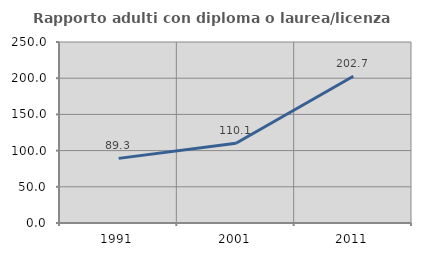
| Category | Rapporto adulti con diploma o laurea/licenza media  |
|---|---|
| 1991.0 | 89.256 |
| 2001.0 | 110.127 |
| 2011.0 | 202.703 |